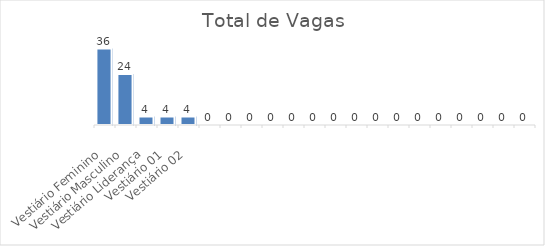
| Category |  Total de Vagas |
|---|---|
| Vestiário Feminino | 36 |
| Vestiário Masculino | 24 |
| Vestiário Liderança | 4 |
| Vestiário 01 | 4 |
| Vestiário 02 | 4 |